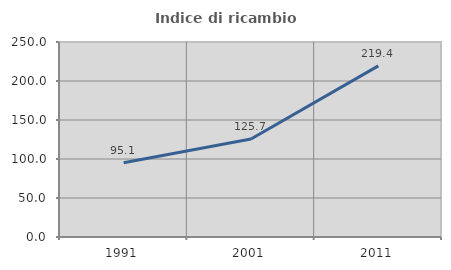
| Category | Indice di ricambio occupazionale  |
|---|---|
| 1991.0 | 95.122 |
| 2001.0 | 125.658 |
| 2011.0 | 219.444 |